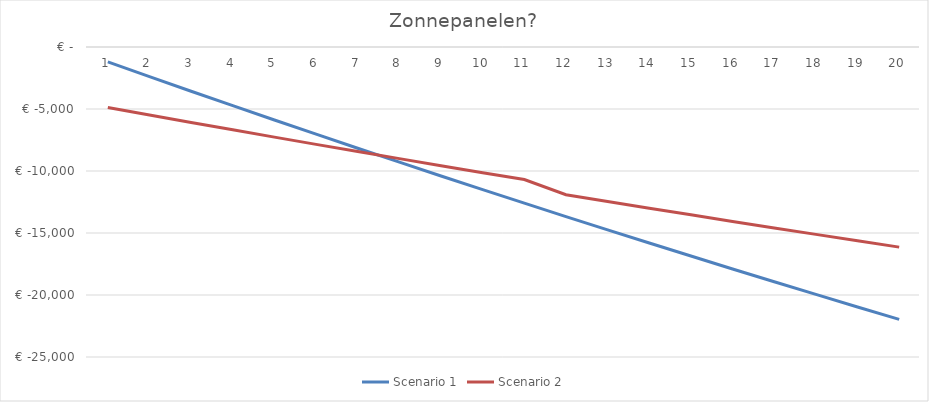
| Category | Scenario 1 | Scenario 2 |
|---|---|---|
| 0 | -1200 | -4878.25 |
| 1 | -2388.679 | -5484.476 |
| 2 | -3566.145 | -6084.984 |
| 3 | -4732.502 | -6679.826 |
| 4 | -5887.855 | -7269.056 |
| 5 | -7032.31 | -7852.728 |
| 6 | -8165.967 | -8430.893 |
| 7 | -9288.93 | -9003.604 |
| 8 | -10401.298 | -9570.912 |
| 9 | -11503.173 | -10132.868 |
| 10 | -12594.652 | -10689.523 |
| 11 | -13675.835 | -11909.999 |
| 12 | -14746.817 | -12456.2 |
| 13 | -15807.697 | -12997.248 |
| 14 | -16858.567 | -13533.192 |
| 15 | -17899.524 | -14064.08 |
| 16 | -18930.661 | -14589.96 |
| 17 | -19952.07 | -15110.878 |
| 18 | -20963.843 | -15626.883 |
| 19 | -21966.071 | -16138.019 |